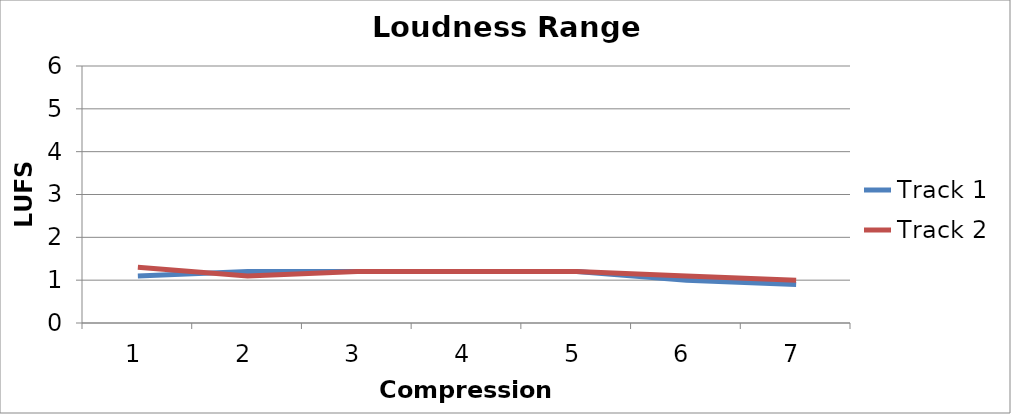
| Category | Track 1 | Track 2 |
|---|---|---|
| 0 | 1.1 | 1.3 |
| 1 | 1.2 | 1.1 |
| 2 | 1.2 | 1.2 |
| 3 | 1.2 | 1.2 |
| 4 | 1.2 | 1.2 |
| 5 | 1 | 1.1 |
| 6 | 0.9 | 1 |